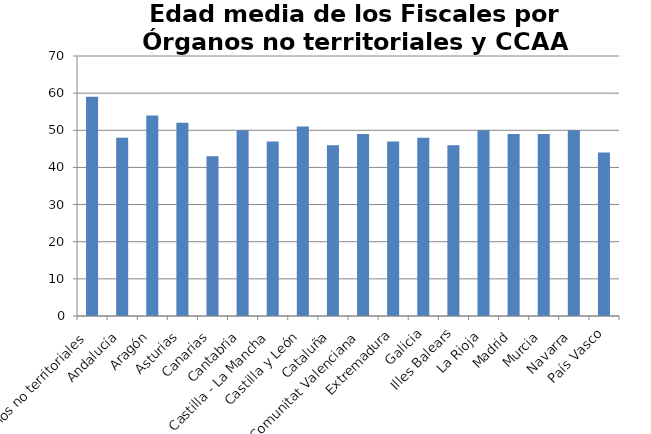
| Category | Edad Media |
|---|---|
| Órganos no territoriales | 59 |
| Andalucía | 48 |
| Aragón | 54 |
| Asturias | 52 |
| Canarias | 43 |
| Cantabria | 50 |
| Castilla - La Mancha | 47 |
| Castilla y León | 51 |
| Cataluña | 46 |
| Comunitat Valenciana | 49 |
| Extremadura | 47 |
| Galicia | 48 |
| Illes Balears | 46 |
| La Rioja | 50 |
| Madrid | 49 |
| Murcia | 49 |
| Navarra | 50 |
| País Vasco | 44 |